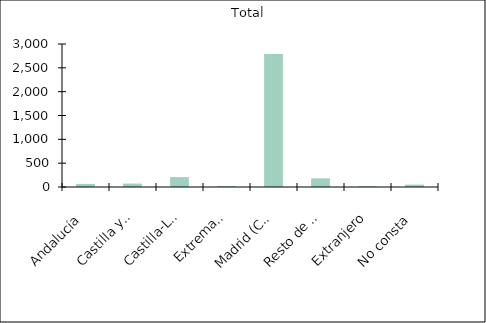
| Category | Total |
|---|---|
|    Andalucía | 65 |
|    Castilla y León | 72 |
|    Castilla-La Mancha | 208 |
|    Extremadura | 19 |
|    Madrid (Comunidad de) | 2791 |
|    Resto de CCAA | 181 |
|    Extranjero | 15 |
|    No consta | 50 |